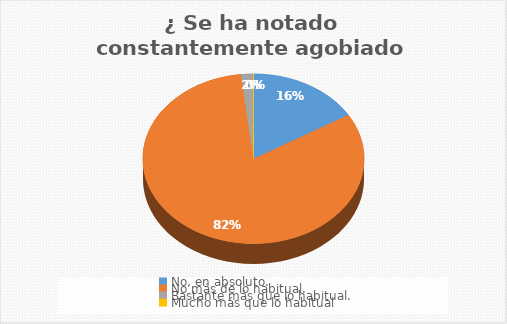
| Category | ¿ Se ha notado constantemente agobiado en tensión? |
|---|---|
| No, en absoluto. | 18 |
| No más de lo habitual. | 90 |
| Bastante más que lo habitual. | 2 |
| Mucho más que lo habitual | 0 |